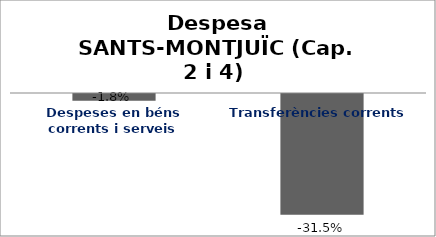
| Category | Series 0 |
|---|---|
| Despeses en béns corrents i serveis | -0.018 |
| Transferències corrents | -0.315 |